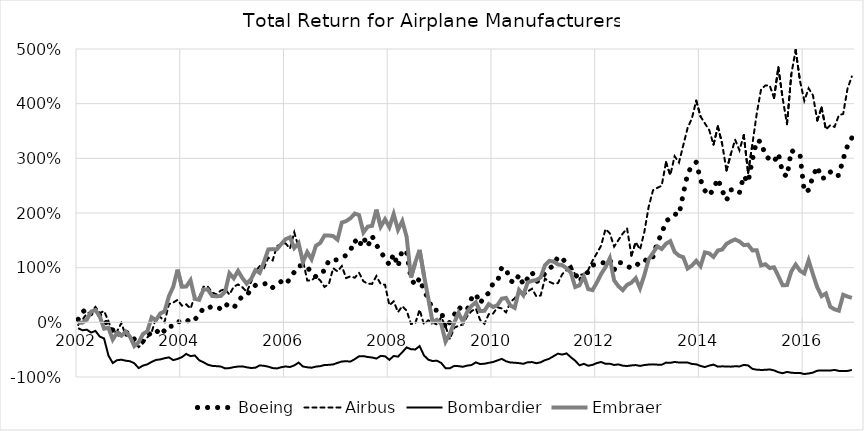
| Category | Boeing | Airbus | Bombardier | Embraer |
|---|---|---|---|---|
| 2002-01-31 | 0.055 | -0.048 | -0.108 | -0.01 |
| 2002-02-28 | 0.189 | 0.048 | -0.145 | -0.006 |
| 2002-03-31 | 0.246 | 0.161 | -0.134 | 0.049 |
| 2002-04-30 | 0.15 | 0.192 | -0.187 | 0.196 |
| 2002-05-31 | 0.102 | 0.282 | -0.157 | 0.224 |
| 2002-06-30 | 0.135 | 0.171 | -0.26 | 0.108 |
| 2002-07-31 | 0.045 | 0.205 | -0.295 | -0.117 |
| 2002-08-31 | -0.064 | 0.022 | -0.607 | -0.098 |
| 2002-09-30 | -0.139 | -0.195 | -0.745 | -0.315 |
| 2002-10-31 | -0.251 | -0.166 | -0.693 | -0.193 |
| 2002-11-30 | -0.152 | -0.013 | -0.684 | -0.245 |
| 2002-12-31 | -0.179 | -0.241 | -0.702 | -0.168 |
| 2003-01-31 | -0.215 | -0.253 | -0.711 | -0.263 |
| 2003-02-28 | -0.309 | -0.36 | -0.75 | -0.434 |
| 2003-03-31 | -0.372 | -0.453 | -0.837 | -0.364 |
| 2003-04-30 | -0.344 | -0.385 | -0.791 | -0.213 |
| 2003-05-31 | -0.259 | -0.276 | -0.768 | -0.164 |
| 2003-06-30 | -0.172 | -0.184 | -0.724 | 0.09 |
| 2003-07-31 | -0.201 | 0.082 | -0.688 | 0.039 |
| 2003-08-31 | -0.094 | 0.099 | -0.678 | 0.162 |
| 2003-09-30 | -0.169 | 0.009 | -0.657 | 0.202 |
| 2003-10-31 | -0.069 | 0.333 | -0.641 | 0.477 |
| 2003-11-30 | -0.075 | 0.362 | -0.691 | 0.65 |
| 2003-12-31 | 0.015 | 0.41 | -0.67 | 0.964 |
| 2004-01-31 | 0.005 | 0.305 | -0.637 | 0.651 |
| 2004-02-28 | 0.052 | 0.329 | -0.578 | 0.655 |
| 2004-03-31 | -0.004 | 0.252 | -0.618 | 0.77 |
| 2004-04-30 | 0.053 | 0.483 | -0.606 | 0.43 |
| 2004-05-31 | 0.134 | 0.458 | -0.693 | 0.411 |
| 2004-06-30 | 0.264 | 0.652 | -0.73 | 0.6 |
| 2004-07-31 | 0.255 | 0.652 | -0.775 | 0.599 |
| 2004-08-31 | 0.295 | 0.548 | -0.796 | 0.483 |
| 2004-09-30 | 0.287 | 0.51 | -0.802 | 0.476 |
| 2004-10-31 | 0.243 | 0.581 | -0.808 | 0.483 |
| 2004-11-30 | 0.338 | 0.607 | -0.843 | 0.56 |
| 2004-12-31 | 0.29 | 0.508 | -0.837 | 0.898 |
| 2005-01-31 | 0.259 | 0.651 | -0.819 | 0.804 |
| 2005-02-28 | 0.391 | 0.693 | -0.809 | 0.941 |
| 2005-03-31 | 0.476 | 0.641 | -0.806 | 0.81 |
| 2005-04-30 | 0.492 | 0.556 | -0.823 | 0.708 |
| 2005-05-31 | 0.604 | 0.738 | -0.835 | 0.791 |
| 2005-06-30 | 0.677 | 0.93 | -0.83 | 0.953 |
| 2005-07-31 | 0.673 | 1.027 | -0.788 | 0.905 |
| 2005-08-31 | 0.7 | 0.994 | -0.796 | 1.107 |
| 2005-09-30 | 0.726 | 1.183 | -0.811 | 1.334 |
| 2005-10-31 | 0.637 | 1.133 | -0.837 | 1.339 |
| 2005-11-30 | 0.702 | 1.398 | -0.843 | 1.338 |
| 2005-12-31 | 0.748 | 1.426 | -0.821 | 1.433 |
| 2006-01-31 | 0.694 | 1.444 | -0.807 | 1.521 |
| 2006-02-28 | 0.797 | 1.348 | -0.817 | 1.555 |
| 2006-03-31 | 0.92 | 1.646 | -0.788 | 1.359 |
| 2006-04-30 | 1.037 | 1.37 | -0.736 | 1.45 |
| 2006-05-31 | 1.03 | 1.14 | -0.808 | 1.1 |
| 2006-06-30 | 1.016 | 0.766 | -0.823 | 1.285 |
| 2006-07-31 | 0.898 | 0.766 | -0.83 | 1.154 |
| 2006-08-31 | 0.835 | 0.836 | -0.81 | 1.399 |
| 2006-09-30 | 0.921 | 0.766 | -0.802 | 1.451 |
| 2006-10-31 | 0.938 | 0.648 | -0.781 | 1.589 |
| 2006-11-30 | 1.138 | 0.699 | -0.778 | 1.588 |
| 2006-12-31 | 1.137 | 0.99 | -0.77 | 1.578 |
| 2007-01-31 | 1.145 | 0.932 | -0.742 | 1.512 |
| 2007-02-28 | 1.191 | 1.029 | -0.716 | 1.825 |
| 2007-03-31 | 1.223 | 0.81 | -0.711 | 1.852 |
| 2007-04-30 | 1.316 | 0.841 | -0.718 | 1.905 |
| 2007-05-31 | 1.505 | 0.816 | -0.673 | 1.99 |
| 2007-06-30 | 1.385 | 0.905 | -0.619 | 1.962 |
| 2007-07-31 | 1.556 | 0.751 | -0.618 | 1.644 |
| 2007-08-31 | 1.387 | 0.705 | -0.634 | 1.751 |
| 2007-09-30 | 1.58 | 0.703 | -0.643 | 1.766 |
| 2007-10-31 | 1.415 | 0.846 | -0.663 | 2.062 |
| 2007-11-30 | 1.296 | 0.7 | -0.614 | 1.75 |
| 2007-12-31 | 1.164 | 0.687 | -0.621 | 1.885 |
| 2008-01-31 | 1.053 | 0.313 | -0.686 | 1.741 |
| 2008-02-28 | 1.252 | 0.383 | -0.615 | 1.981 |
| 2008-03-31 | 1.019 | 0.189 | -0.627 | 1.692 |
| 2008-04-30 | 1.329 | 0.296 | -0.546 | 1.852 |
| 2008-05-31 | 1.278 | 0.212 | -0.458 | 1.563 |
| 2008-06-30 | 0.805 | -0.03 | -0.492 | 0.82 |
| 2008-07-31 | 0.676 | -0.02 | -0.496 | 1.096 |
| 2008-08-31 | 0.806 | 0.232 | -0.434 | 1.325 |
| 2008-09-30 | 0.577 | -0.038 | -0.605 | 0.861 |
| 2008-10-31 | 0.441 | 0.037 | -0.682 | 0.44 |
| 2008-11-30 | 0.221 | -0.005 | -0.708 | 0.002 |
| 2008-12-31 | 0.222 | -0.039 | -0.701 | 0.046 |
| 2009-01-31 | 0.211 | 0.094 | -0.743 | -0.027 |
| 2009-02-28 | -0.11 | -0.077 | -0.839 | -0.353 |
| 2009-03-31 | 0.007 | -0.307 | -0.84 | -0.205 |
| 2009-04-30 | 0.135 | -0.1 | -0.796 | -0.008 |
| 2009-05-31 | 0.283 | -0.063 | -0.801 | 0.173 |
| 2009-06-30 | 0.216 | -0.042 | -0.813 | 0.013 |
| 2009-07-31 | 0.227 | 0.113 | -0.791 | 0.192 |
| 2009-08-31 | 0.434 | 0.203 | -0.781 | 0.299 |
| 2009-09-30 | 0.521 | 0.253 | -0.733 | 0.367 |
| 2009-10-31 | 0.343 | 0.044 | -0.763 | 0.206 |
| 2009-11-30 | 0.485 | -0.027 | -0.758 | 0.211 |
| 2009-12-31 | 0.534 | 0.15 | -0.74 | 0.334 |
| 2010-01-31 | 0.717 | 0.16 | -0.726 | 0.281 |
| 2010-02-28 | 0.745 | 0.276 | -0.697 | 0.314 |
| 2010-03-31 | 1.006 | 0.254 | -0.668 | 0.433 |
| 2010-04-30 | 0.976 | 0.182 | -0.712 | 0.446 |
| 2010-05-31 | 0.761 | 0.372 | -0.735 | 0.308 |
| 2010-06-30 | 0.722 | 0.439 | -0.738 | 0.264 |
| 2010-07-31 | 0.869 | 0.551 | -0.747 | 0.591 |
| 2010-08-31 | 0.687 | 0.481 | -0.759 | 0.496 |
| 2010-09-30 | 0.808 | 0.565 | -0.73 | 0.73 |
| 2010-10-31 | 0.919 | 0.615 | -0.727 | 0.758 |
| 2010-11-30 | 0.742 | 0.476 | -0.748 | 0.775 |
| 2010-12-31 | 0.783 | 0.491 | -0.731 | 0.82 |
| 2011-01-31 | 0.898 | 0.8 | -0.693 | 1.043 |
| 2011-02-28 | 0.986 | 0.742 | -0.665 | 1.124 |
| 2011-03-31 | 1.038 | 0.707 | -0.618 | 1.111 |
| 2011-04-30 | 1.203 | 0.717 | -0.573 | 1.059 |
| 2011-05-31 | 1.167 | 0.881 | -0.59 | 1.047 |
| 2011-06-30 | 1.08 | 0.955 | -0.568 | 0.988 |
| 2011-07-31 | 0.983 | 1.05 | -0.64 | 0.907 |
| 2011-08-31 | 0.895 | 0.871 | -0.703 | 0.646 |
| 2011-09-30 | 0.737 | 0.867 | -0.787 | 0.677 |
| 2011-10-31 | 0.888 | 0.881 | -0.759 | 0.839 |
| 2011-11-30 | 0.915 | 0.956 | -0.794 | 0.608 |
| 2011-12-31 | 1.044 | 1.128 | -0.778 | 0.589 |
| 2012-01-31 | 1.068 | 1.263 | -0.745 | 0.728 |
| 2012-02-28 | 1.097 | 1.402 | -0.725 | 0.886 |
| 2012-03-31 | 1.08 | 1.705 | -0.759 | 1.006 |
| 2012-04-30 | 1.148 | 1.628 | -0.757 | 1.173 |
| 2012-05-31 | 0.959 | 1.385 | -0.78 | 0.769 |
| 2012-06-30 | 1.097 | 1.505 | -0.769 | 0.661 |
| 2012-07-31 | 1.086 | 1.623 | -0.793 | 0.589 |
| 2012-08-31 | 1.027 | 1.718 | -0.799 | 0.687 |
| 2012-09-30 | 0.992 | 1.221 | -0.788 | 0.725 |
| 2012-10-31 | 1.016 | 1.468 | -0.782 | 0.808 |
| 2012-11-30 | 1.119 | 1.331 | -0.797 | 0.624 |
| 2012-12-31 | 1.15 | 1.656 | -0.781 | 0.863 |
| 2013-01-31 | 1.107 | 2.116 | -0.773 | 1.155 |
| 2013-02-28 | 1.204 | 2.416 | -0.769 | 1.27 |
| 2013-03-31 | 1.46 | 2.461 | -0.774 | 1.391 |
| 2013-04-30 | 1.62 | 2.497 | -0.776 | 1.341 |
| 2013-05-31 | 1.852 | 2.928 | -0.736 | 1.437 |
| 2013-06-30 | 1.906 | 2.695 | -0.741 | 1.485 |
| 2013-07-31 | 1.982 | 3.039 | -0.725 | 1.288 |
| 2013-08-31 | 1.962 | 2.923 | -0.734 | 1.219 |
| 2013-09-30 | 2.349 | 3.237 | -0.733 | 1.192 |
| 2013-10-31 | 2.719 | 3.554 | -0.736 | 0.984 |
| 2013-11-30 | 2.864 | 3.733 | -0.761 | 1.039 |
| 2013-12-31 | 2.929 | 4.054 | -0.768 | 1.126 |
| 2014-01-31 | 2.606 | 3.765 | -0.798 | 1.027 |
| 2014-02-28 | 2.41 | 3.639 | -0.818 | 1.281 |
| 2014-03-31 | 2.319 | 3.518 | -0.791 | 1.26 |
| 2014-04-30 | 2.441 | 3.251 | -0.773 | 1.197 |
| 2014-05-31 | 2.627 | 3.583 | -0.81 | 1.314 |
| 2014-06-30 | 2.412 | 3.263 | -0.805 | 1.332 |
| 2014-07-31 | 2.231 | 2.777 | -0.807 | 1.435 |
| 2014-08-31 | 2.422 | 3.077 | -0.811 | 1.481 |
| 2014-09-30 | 2.437 | 3.34 | -0.804 | 1.516 |
| 2014-10-31 | 2.371 | 3.147 | -0.807 | 1.479 |
| 2014-11-30 | 2.679 | 3.426 | -0.779 | 1.412 |
| 2014-12-31 | 2.559 | 2.735 | -0.788 | 1.42 |
| 2015-01-31 | 2.98 | 3.264 | -0.852 | 1.315 |
| 2015-02-28 | 3.326 | 3.819 | -0.866 | 1.319 |
| 2015-03-31 | 3.304 | 4.264 | -0.871 | 1.041 |
| 2015-04-30 | 3.041 | 4.334 | -0.869 | 1.063 |
| 2015-05-31 | 2.987 | 4.334 | -0.861 | 0.993 |
| 2015-06-30 | 2.936 | 4.104 | -0.879 | 1.007 |
| 2015-07-31 | 3.09 | 4.665 | -0.912 | 0.846 |
| 2015-08-31 | 2.731 | 4.094 | -0.931 | 0.678 |
| 2015-09-30 | 2.667 | 3.625 | -0.907 | 0.682 |
| 2015-10-31 | 3.146 | 4.538 | -0.921 | 0.931 |
| 2015-11-30 | 3.098 | 4.982 | -0.928 | 1.057 |
| 2015-12-31 | 3.073 | 4.419 | -0.926 | 0.945 |
| 2016-01-31 | 2.384 | 4.053 | -0.946 | 0.894 |
| 2016-02-28 | 2.419 | 4.281 | -0.935 | 1.134 |
| 2016-03-31 | 2.672 | 4.153 | -0.919 | 0.879 |
| 2016-04-30 | 2.849 | 3.693 | -0.885 | 0.642 |
| 2016-05-31 | 2.631 | 3.929 | -0.88 | 0.48 |
| 2016-06-30 | 2.649 | 3.528 | -0.883 | 0.528 |
| 2016-07-31 | 2.754 | 3.606 | -0.882 | 0.285 |
| 2016-08-31 | 2.665 | 3.575 | -0.87 | 0.238 |
| 2016-09-30 | 2.691 | 3.788 | -0.888 | 0.214 |
| 2016-10-31 | 2.989 | 3.814 | -0.89 | 0.504 |
| 2016-11-30 | 3.232 | 4.275 | -0.888 | 0.473 |
| 2016-12-31 | 3.374 | 4.498 | -0.872 | 0.447 |